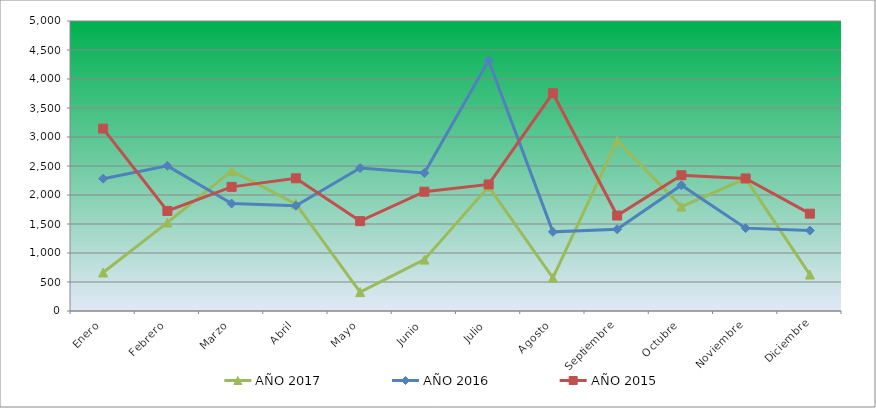
| Category | AÑO 2017 | AÑO 2016 | AÑO 2015 |
|---|---|---|---|
| Enero | 663.854 | 2281.268 | 3145.024 |
| Febrero | 1524.469 | 2502.234 | 1725.03 |
| Marzo | 2416.172 | 1852.253 | 2140.509 |
| Abril | 1847.751 | 1815.208 | 2287.768 |
| Mayo | 327.033 | 2464.361 | 1549.704 |
| Junio | 885.905 | 2380.436 | 2056.362 |
| Julio | 2144.957 | 4319.022 | 2182.583 |
| Agosto | 571.905 | 1364.262 | 3755.095 |
| Septiembre | 2937.054 | 1409.406 | 1646.141 |
| Octubre | 1800.227 | 2169.782 | 2340.276 |
| Noviembre | 2283.522 | 1428.831 | 2285.622 |
| Diciembre | 628.29 | 1386.544 | 1677.817 |